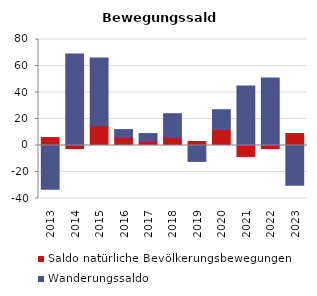
| Category | Saldo natürliche Bevölkerungsbewegungen | Wanderungssaldo |
|---|---|---|
| 2013.0 | 6 | -33 |
| 2014.0 | -3 | 69 |
| 2015.0 | 15 | 51 |
| 2016.0 | 6 | 6 |
| 2017.0 | 3 | 6 |
| 2018.0 | 6 | 18 |
| 2019.0 | 3 | -12 |
| 2020.0 | 12 | 15 |
| 2021.0 | -9 | 45 |
| 2022.0 | -3 | 51 |
| 2023.0 | 9 | -30 |